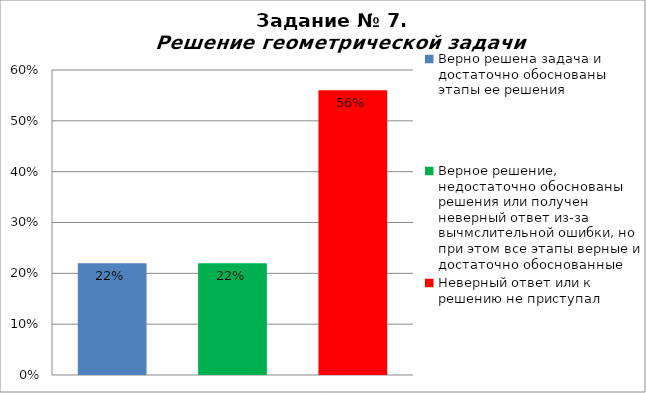
| Category | Решение геометрической задачи  |
|---|---|
| Верно решена задача и достаточно обоснованы этапы ее решения | 0.22 |
| Верное решение, недостаточно обоснованы решения или получен неверный ответ из-за вычмслительной ошибки, но при этом все этапы верные и достаточно обоснованные | 0.22 |
| Неверный ответ или к решению не приступал | 0.56 |